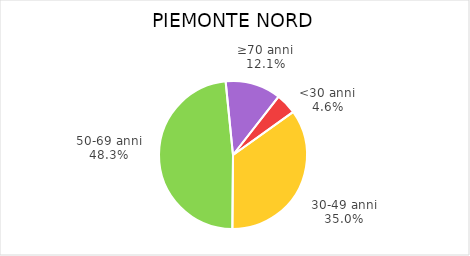
| Category | Piemonte Nord |
|---|---|
| <30 anni | 2876 |
| 30-49 anni | 22111 |
| 50-69 anni | 30477 |
| ≥70 anni | 7668 |